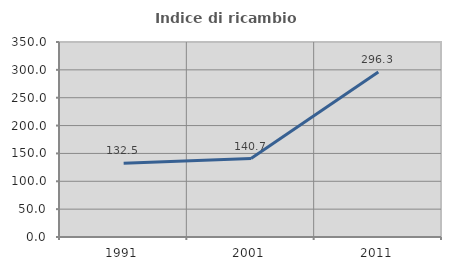
| Category | Indice di ricambio occupazionale  |
|---|---|
| 1991.0 | 132.5 |
| 2001.0 | 140.719 |
| 2011.0 | 296.33 |